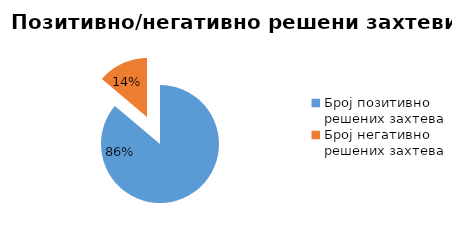
| Category | Series 0 |
|---|---|
| Број позитивно решених захтева | 22658 |
| Број негативно решених захтева | 3648 |